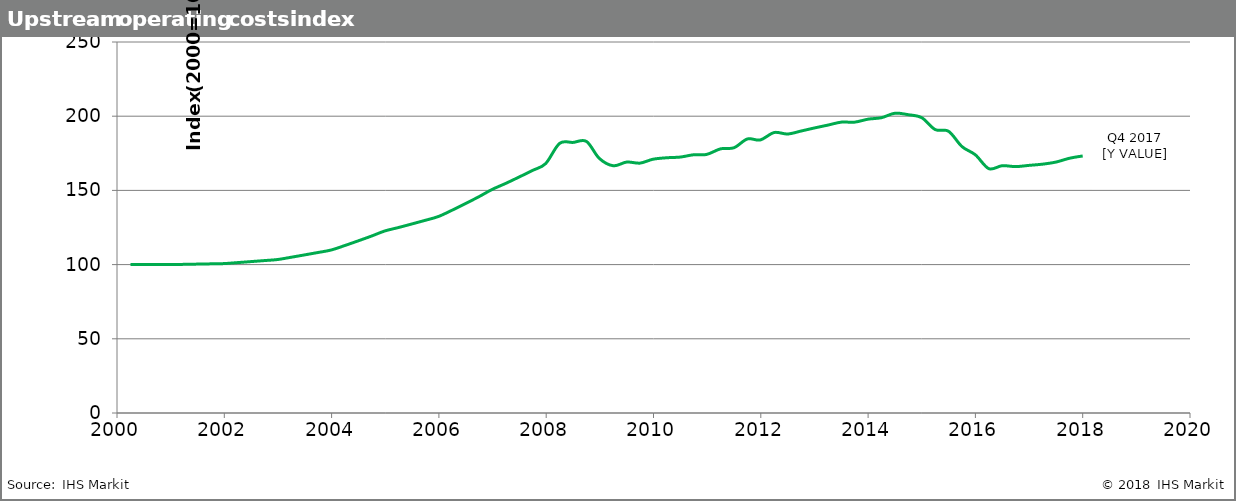
| Category | UOCI |
|---|---|
| 2000.25 | 100 |
| 2000.5 | 100 |
| 2000.75 | 100 |
| 2000.99 | 100 |
| 2001.25 | 100.168 |
| 2001.5 | 100.336 |
| 2001.75 | 100.504 |
| 2001.99 | 100.673 |
| 2002.25 | 101.35 |
| 2002.5 | 102.031 |
| 2002.75 | 102.717 |
| 2002.99 | 103.407 |
| 2003.25 | 104.974 |
| 2003.5 | 106.564 |
| 2003.75 | 108.178 |
| 2003.99 | 109.817 |
| 2004.25 | 112.892 |
| 2004.5 | 116.054 |
| 2004.75 | 119.304 |
| 2004.99 | 122.645 |
| 2005.25 | 125.012 |
| 2005.5 | 127.424 |
| 2005.75 | 129.883 |
| 2005.99 | 132.389 |
| 2006.25 | 136.725 |
| 2006.5 | 141.203 |
| 2006.75 | 145.827 |
| 2006.99 | 150.604 |
| 2007.25 | 154.794 |
| 2007.5 | 159.102 |
| 2007.75 | 163.529 |
| 2007.99 | 168.079 |
| 2008.25 | 181.682 |
| 2008.5 | 182.338 |
| 2008.75 | 182.995 |
| 2008.99 | 171.562 |
| 2009.25 | 166.606 |
| 2009.5 | 169.095 |
| 2009.75 | 168.387 |
| 2009.99 | 171 |
| 2010.25 | 172 |
| 2010.5 | 172.459 |
| 2010.75 | 174.027 |
| 2010.99 | 174.224 |
| 2011.25 | 178 |
| 2011.5 | 178.745 |
| 2011.75 | 184.666 |
| 2011.99 | 184 |
| 2012.25 | 189 |
| 2012.5 | 188 |
| 2012.75 | 190 |
| 2012.99 | 192 |
| 2013.25 | 194 |
| 2013.5 | 196 |
| 2013.75 | 196 |
| 2014.0 | 198 |
| 2014.25 | 199 |
| 2014.5 | 202 |
| 2014.75 | 201 |
| 2015.0 | 199 |
| 2015.25 | 191 |
| 2015.5 | 189.831 |
| 2015.75 | 179.516 |
| 2016.0 | 173.97 |
| 2016.25 | 164.662 |
| 2016.5 | 166.644 |
| 2016.75 | 166.024 |
| 2017.0 | 166.862 |
| 2017.25 | 167.671 |
| 2017.5 | 169.072 |
| 2017.75 | 171.627 |
| 2018.0 | 173.22 |